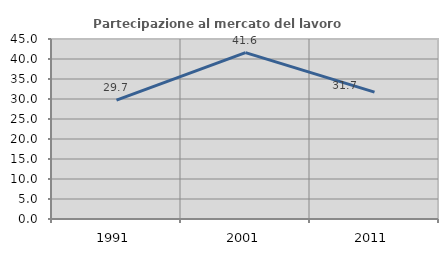
| Category | Partecipazione al mercato del lavoro  femminile |
|---|---|
| 1991.0 | 29.721 |
| 2001.0 | 41.596 |
| 2011.0 | 31.716 |